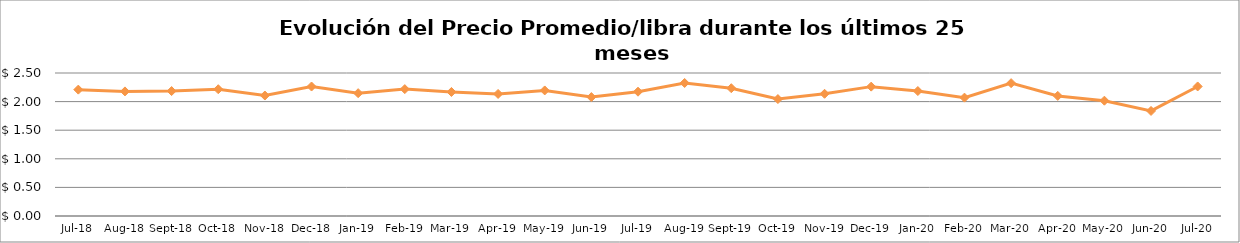
| Category | Series 0 |
|---|---|
| 2018-07-01 | 2.209 |
| 2018-08-01 | 2.178 |
| 2018-09-01 | 2.184 |
| 2018-10-01 | 2.216 |
| 2018-11-01 | 2.106 |
| 2018-12-01 | 2.264 |
| 2019-01-01 | 2.147 |
| 2019-02-01 | 2.218 |
| 2019-03-01 | 2.169 |
| 2019-04-01 | 2.134 |
| 2019-05-01 | 2.195 |
| 2019-06-01 | 2.079 |
| 2019-07-01 | 2.173 |
| 2019-08-01 | 2.326 |
| 2019-09-01 | 2.234 |
| 2019-10-01 | 2.044 |
| 2019-11-01 | 2.137 |
| 2019-12-01 | 2.262 |
| 2020-01-01 | 2.185 |
| 2020-02-01 | 2.069 |
| 2020-03-01 | 2.323 |
| 2020-04-01 | 2.1 |
| 2020-05-01 | 2.016 |
| 2020-06-01 | 1.837 |
| 2020-07-01 | 2.265 |